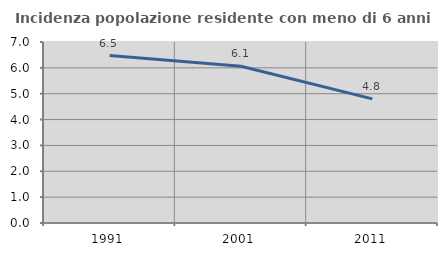
| Category | Incidenza popolazione residente con meno di 6 anni |
|---|---|
| 1991.0 | 6.474 |
| 2001.0 | 6.061 |
| 2011.0 | 4.8 |